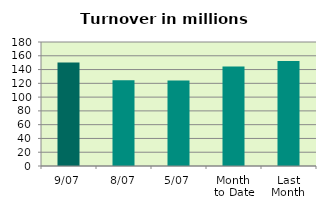
| Category | Series 0 |
|---|---|
| 9/07 | 150.188 |
| 8/07 | 124.486 |
| 5/07 | 123.967 |
| Month 
to Date | 144.482 |
| Last
Month | 152.535 |